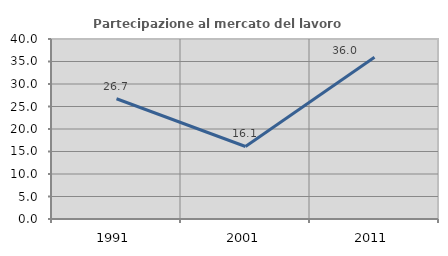
| Category | Partecipazione al mercato del lavoro  femminile |
|---|---|
| 1991.0 | 26.728 |
| 2001.0 | 16.111 |
| 2011.0 | 35.955 |